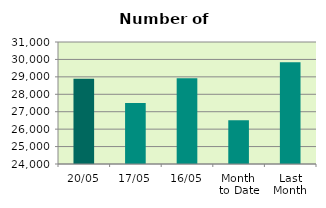
| Category | Series 0 |
|---|---|
| 20/05 | 28898 |
| 17/05 | 27494 |
| 16/05 | 28924 |
| Month 
to Date | 26509.385 |
| Last
Month | 29833 |